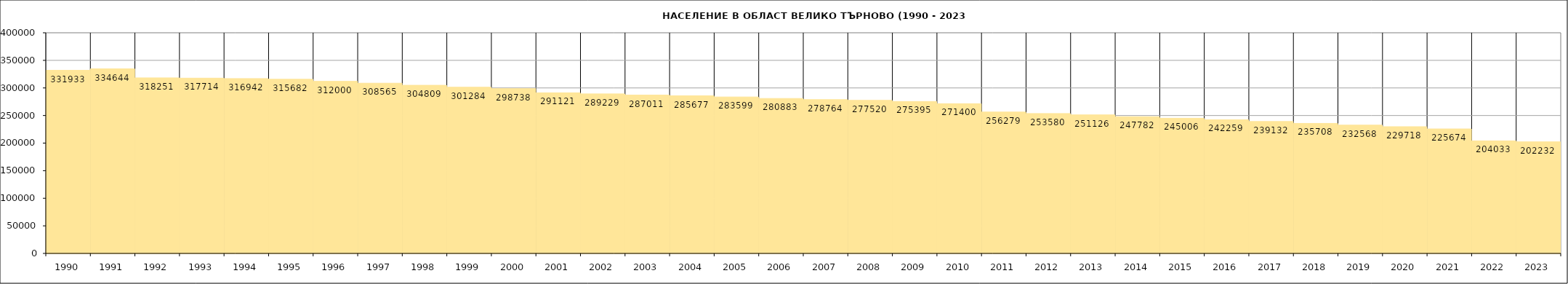
| Category | Series 1 | Series 0 |
|---|---|---|
| 1990.0 | 331933 |  |
| 1991.0 | 334644 |  |
| 1992.0 | 318251 |  |
| 1993.0 | 317714 |  |
| 1994.0 | 316942 |  |
| 1995.0 | 315682 |  |
| 1996.0 | 312000 |  |
| 1997.0 | 308565 |  |
| 1998.0 | 304809 |  |
| 1999.0 | 301284 |  |
| 2000.0 | 298738 |  |
| 2001.0 | 291121 |  |
| 2002.0 | 289229 |  |
| 2003.0 | 287011 |  |
| 2004.0 | 285677 |  |
| 2005.0 | 283599 |  |
| 2006.0 | 280883 |  |
| 2007.0 | 278764 |  |
| 2008.0 | 277520 |  |
| 2009.0 | 275395 |  |
| 2010.0 | 271400 |  |
| 2011.0 | 256279 |  |
| 2012.0 | 253580 |  |
| 2013.0 | 251126 |  |
| 2014.0 | 247782 |  |
| 2015.0 | 245006 |  |
| 2016.0 | 242259 |  |
| 2017.0 | 239132 |  |
| 2018.0 | 235708 |  |
| 2019.0 | 232568 |  |
| 2020.0 | 229718 |  |
| 2021.0 | 225674 |  |
| 2022.0 | 204033 |  |
| 2023.0 | 202232 |  |